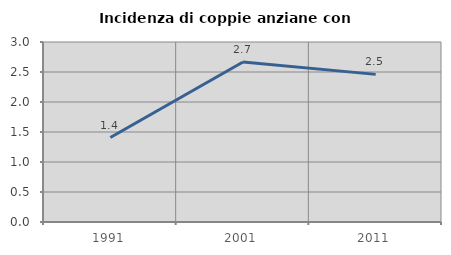
| Category | Incidenza di coppie anziane con figli |
|---|---|
| 1991.0 | 1.407 |
| 2001.0 | 2.667 |
| 2011.0 | 2.46 |